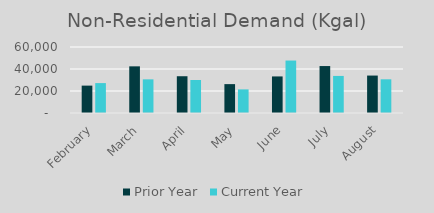
| Category | Prior Year | Current Year |
|---|---|---|
| February | 24891.705 | 27184.287 |
| March | 42416.796 | 30591.784 |
| April | 33427.881 | 30008.586 |
| May | 26254.448 | 21459.484 |
| June | 33248.873 | 47687.401 |
| July | 42679.938 | 33702.696 |
| August | 34036.498 | 30630.765 |